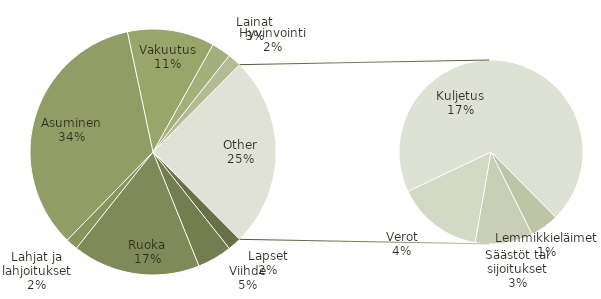
| Category | Summa |
|---|---|
| Lapset | 140 |
| Viihde | 358 |
| Ruoka | 1320 |
| Lahjat ja lahjoitukset | 125 |
| Asuminen | 2702 |
| Vakuutus | 900 |
| Lainat | 200 |
| Hyvinvointi | 140 |
| Lemmikkieläimet | 100 |
| Säästöt tai sijoitukset | 200 |
| Verot | 300 |
| Kuljetus | 1375 |